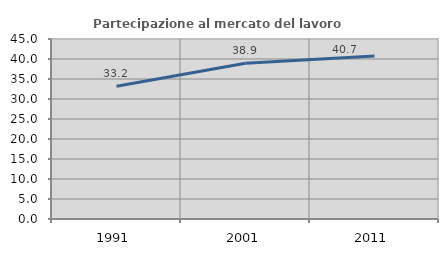
| Category | Partecipazione al mercato del lavoro  femminile |
|---|---|
| 1991.0 | 33.2 |
| 2001.0 | 38.948 |
| 2011.0 | 40.742 |